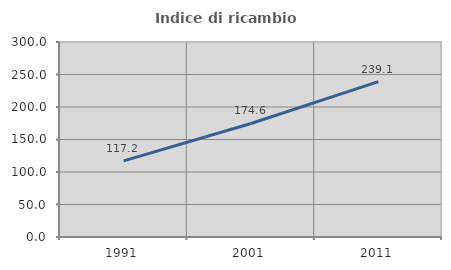
| Category | Indice di ricambio occupazionale  |
|---|---|
| 1991.0 | 117.161 |
| 2001.0 | 174.641 |
| 2011.0 | 239.126 |